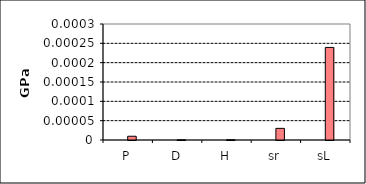
| Category | Series 1 | Series 0 | Series 5 | Series 6 |
|---|---|---|---|---|
| P |  |  | 0 |  |
| D |  |  | 0 |  |
| H |  |  | 0 |  |
| sr |  |  | 0 |  |
| sL |  |  | 0 |  |